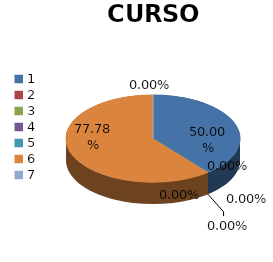
| Category | Series 0 |
|---|---|
| 0 | 0.5 |
| 1 | 0 |
| 2 | 0 |
| 3 | 0 |
| 4 | 0 |
| 5 | 0.778 |
| 6 | 0 |